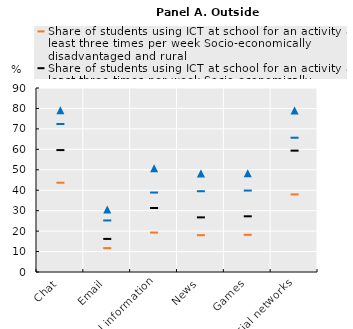
| Category | Series 0 | Series 2 | Series 1 | Series 3 |
|---|---|---|---|---|
| Chat | 43.672 | 59.63 | 72.382 | 79.121 |
| Email | 11.685 | 16.186 | 25.21 | 30.516 |
| Practical information | 19.295 | 31.311 | 38.865 | 50.737 |
| News | 18.016 | 26.717 | 39.508 | 48.235 |
| Games | 18.193 | 27.246 | 39.841 | 48.26 |
| Social networks | 37.948 | 59.369 | 65.677 | 79.038 |